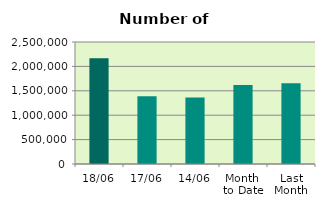
| Category | Series 0 |
|---|---|
| 18/06 | 2165364 |
| 17/06 | 1389086 |
| 14/06 | 1362150 |
| Month 
to Date | 1620155.833 |
| Last
Month | 1656073.545 |